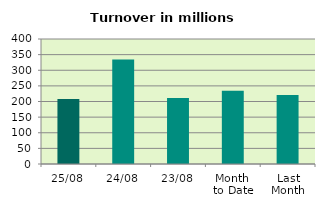
| Category | Series 0 |
|---|---|
| 25/08 | 207.723 |
| 24/08 | 334.361 |
| 23/08 | 211.227 |
| Month 
to Date | 234.295 |
| Last
Month | 220.762 |